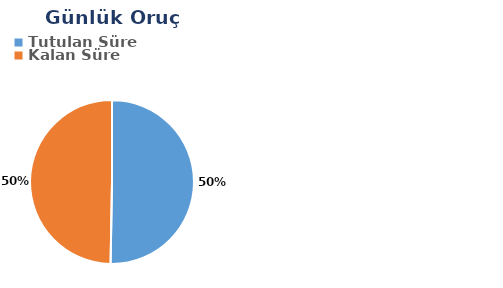
| Category | Günlük |
|---|---|
| Tutulan Süre | 0.292 |
| Kalan Süre | 0.289 |